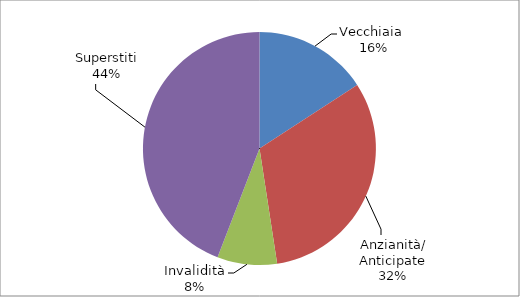
| Category | Series 0 |
|---|---|
| Vecchiaia  | 10926 |
| Anzianità/ Anticipate | 21924 |
| Invalidità | 5721 |
| Superstiti | 30473 |